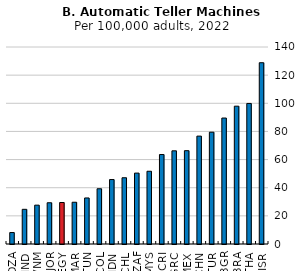
| Category | Number of ATMs per 100,000 adults, 2022 |
|---|---|
| DZA | 8.13 |
| IND | 24.64 |
| VNM | 27.61 |
| JOR | 29.31 |
| EGY | 29.49 |
| MAR | 29.68 |
| TUN | 32.72 |
| COL | 39.26 |
| IDN | 45.8 |
| CHL | 47.08 |
| ZAF | 50.38 |
| MYS | 51.69 |
| CRI | 63.58 |
| GRC | 66.22 |
| MEX | 66.32 |
| CHN | 76.67 |
| TUR | 79.45 |
| BGR | 89.51 |
| BRA | 97.94 |
| THA | 99.89 |
| ISR | 128.82 |